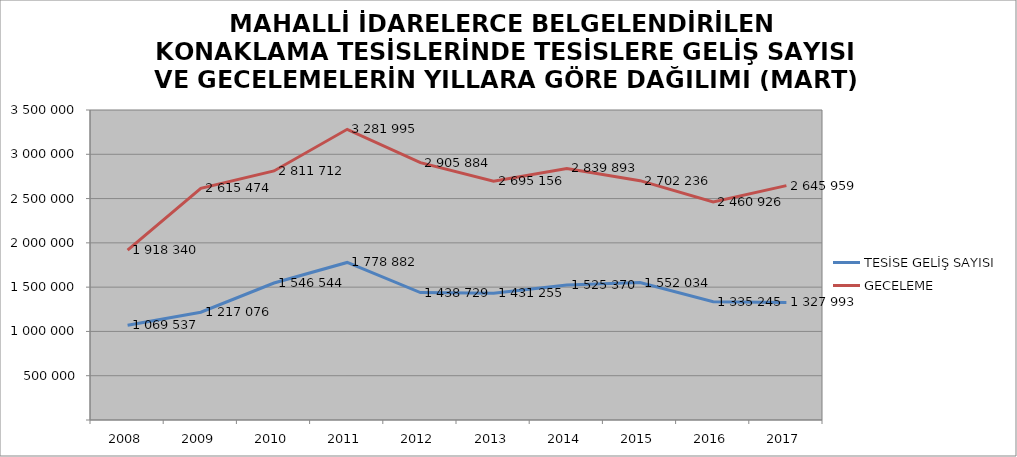
| Category | TESİSE GELİŞ SAYISI | GECELEME |
|---|---|---|
| 2008 | 1069537 | 1918340 |
| 2009 | 1217076 | 2615474 |
| 2010 | 1546544 | 2811712 |
| 2011 | 1778882 | 3281995 |
| 2012 | 1438729 | 2905884 |
| 2013 | 1431255 | 2695156 |
| 2014 | 1525370 | 2839893 |
| 2015 | 1552034 | 2702236 |
| 2016 | 1335245 | 2460926 |
| 2017 | 1327993 | 2645959 |